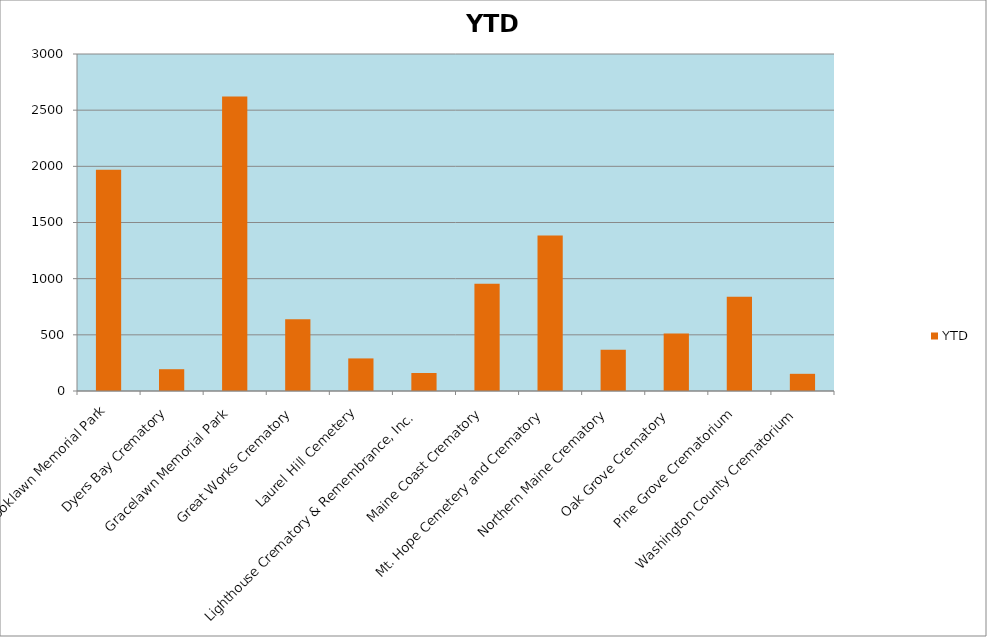
| Category | YTD |
|---|---|
| Brooklawn Memorial Park | 1969 |
| Dyers Bay Crematory | 194 |
| Gracelawn Memorial Park | 2621 |
| Great Works Crematory | 639 |
| Laurel Hill Cemetery | 290 |
| Lighthouse Crematory & Remembrance, Inc. | 160 |
| Maine Coast Crematory | 955 |
| Mt. Hope Cemetery and Crematory | 1385 |
| Northern Maine Crematory | 367 |
| Oak Grove Crematory  | 511 |
| Pine Grove Crematorium | 838 |
| Washington County Crematorium | 153 |